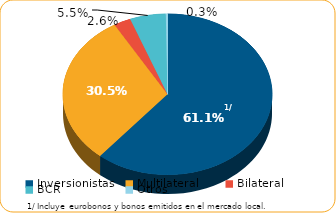
| Category | Series 0 |
|---|---|
| Inversionistas | 7764.3 |
| Multilateral | 3869.9 |
| Bilateral | 333.1 |
| BCR | 704.3 |
| Otros | 33.7 |